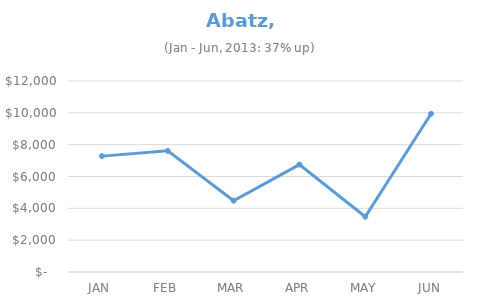
| Category | Series 0 |
|---|---|
| JAN | 7280 |
| FEB | 7610 |
| MAR | 4480 |
| APR | 6750 |
| MAY | 3470 |
| JUN | 9940 |